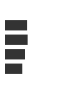
| Category | Series 0 |
|---|---|
| 0 | 0.297 |
| 1 | 0.305 |
| 2 | 0.267 |
| 3 | 0.229 |